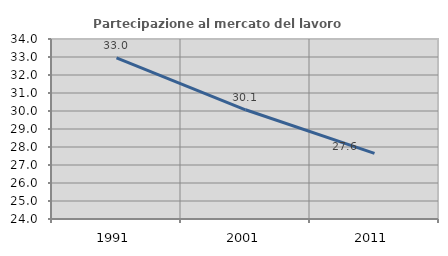
| Category | Partecipazione al mercato del lavoro  femminile |
|---|---|
| 1991.0 | 32.957 |
| 2001.0 | 30.068 |
| 2011.0 | 27.649 |